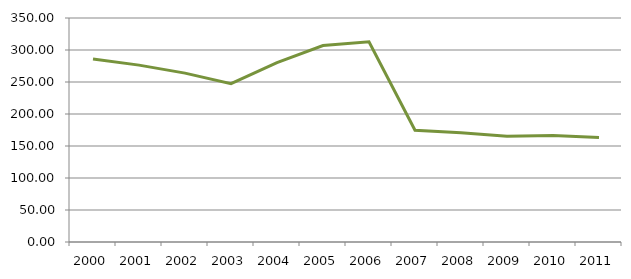
| Category | Spesa c/capitale |
|---|---|
| 2000 | 285.888 |
| 2001 | 276.365 |
| 2002 | 263.901 |
| 2003 | 247.324 |
| 2004 | 280.427 |
| 2005 | 306.977 |
| 2006 | 312.798 |
| 2007 | 174.694 |
| 2008 | 170.802 |
| 2009 | 165.393 |
| 2010 | 166.592 |
| 2011 | 163.265 |